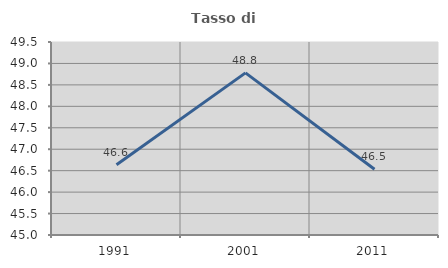
| Category | Tasso di occupazione   |
|---|---|
| 1991.0 | 46.636 |
| 2001.0 | 48.78 |
| 2011.0 | 46.535 |